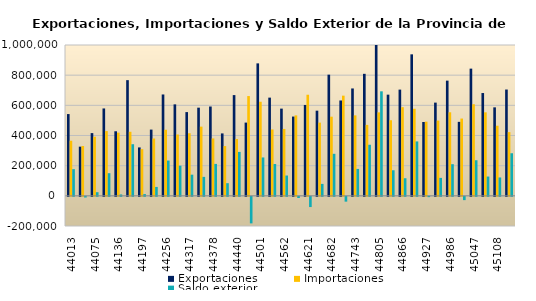
| Category | Exportaciones | Importaciones | Saldo exterior |
|---|---|---|---|
| 2020-07-01 | 542062.84 | 365220.14 | 176842.7 |
| 2020-08-01 | 326019.87 | 330571.15 | -4551.28 |
| 2020-09-01 | 415851.9 | 391765.11 | 24086.79 |
| 2020-10-01 | 579330.62 | 429257.84 | 150072.78 |
| 2020-11-01 | 428116.983 | 418885.529 | 9231.454 |
| 2020-12-01 | 766984.753 | 424753.82 | 342230.933 |
| 2021-01-01 | 321034.51 | 309401.55 | 11632.96 |
| 2021-02-01 | 439118.25 | 380078.53 | 59039.72 |
| 2021-03-01 | 672033.91 | 438109.5 | 233924.41 |
| 2021-04-01 | 606425.01 | 406580.73 | 199844.28 |
| 2021-05-01 | 555191.59 | 414958.96 | 140232.63 |
| 2021-06-01 | 584517.86 | 458749.69 | 125768.17 |
| 2021-07-01 | 592215.46 | 380627.08 | 211588.38 |
| 2021-08-01 | 413833.07 | 329895.94 | 83937.13 |
| 2021-09-01 | 667860.28 | 376602.79 | 291257.49 |
| 2021-10-01 | 485511.53 | 661520.46 | -176008.93 |
| 2021-11-01 | 878182.96 | 623772.34 | 254410.62 |
| 2021-12-01 | 651099.404 | 440022.513 | 211076.891 |
| 2022-01-01 | 578231.872 | 443547.062 | 134684.81 |
| 2022-02-01 | 525546.083 | 533306.789 | -7760.706 |
| 2022-03-01 | 602474.187 | 670231.521 | -67757.334 |
| 2022-04-01 | 564566.111 | 485418.348 | 79147.763 |
| 2022-05-01 | 803329.469 | 524697.141 | 278632.328 |
| 2022-06-01 | 632182.316 | 664140.82 | -31958.504 |
| 2022-07-01 | 711919.091 | 533469.032 | 178450.06 |
| 2022-08-01 | 808936.658 | 470305.866 | 338630.792 |
| 2022-09-01 | 1246269.653 | 553362.196 | 692907.456 |
| 2022-10-01 | 670788.005 | 501262.217 | 169525.788 |
| 2022-11-01 | 704215.36 | 587583.902 | 116631.458 |
| 2022-12-01 | 938097.978 | 577341.702 | 360756.275 |
| 2023-01-01 | 489684.135 | 491778.698 | -2094.564 |
| 2023-02-01 | 618021.806 | 498976.336 | 119045.469 |
| 2023-03-01 | 763721.131 | 553855.733 | 209865.398 |
| 2023-04-01 | 490467.833 | 512326.009 | -21858.176 |
| 2023-05-01 | 843311.598 | 607316.839 | 235994.759 |
| 2023-06-01 | 681562.258 | 553686.761 | 127875.497 |
| 2023-07-01 | 586592.508 | 464822.429 | 121770.078 |
| 2023-08-01 | 704756.206 | 422340.098 | 282416.108 |